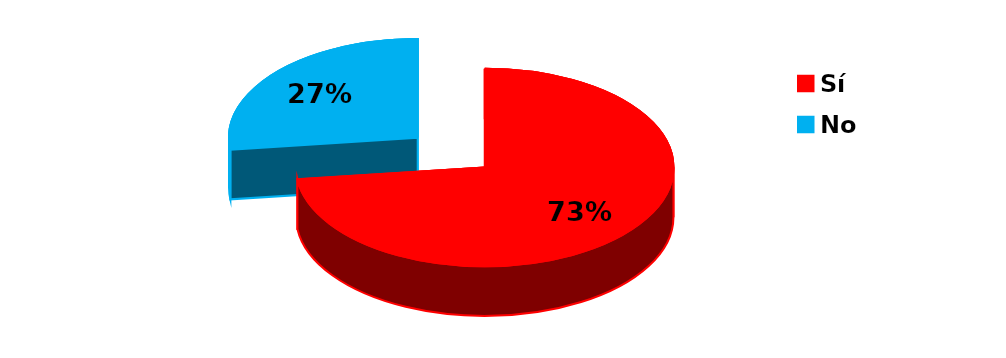
| Category | Series 0 |
|---|---|
| Sí | 372 |
| No | 137 |